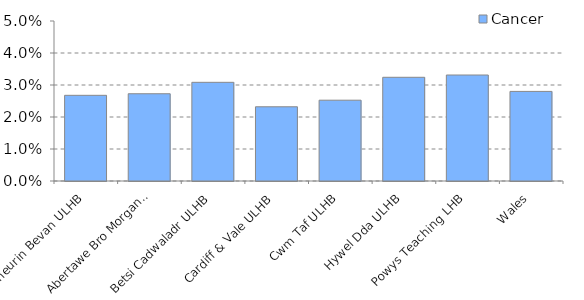
| Category | Cancer |
|---|---|
| Aneurin Bevan ULHB | 0.027 |
| Abertawe Bro Morgannwg ULHB | 0.027 |
| Betsi Cadwaladr ULHB | 0.031 |
| Cardiff & Vale ULHB | 0.023 |
| Cwm Taf ULHB | 0.025 |
| Hywel Dda ULHB | 0.032 |
| Powys Teaching LHB | 0.033 |
| Wales | 0.028 |